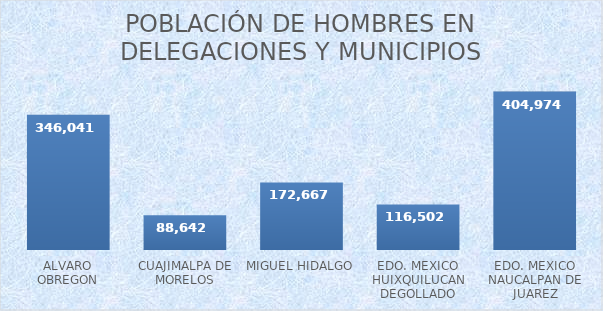
| Category | POBLACIÓN DE HOMBRES |
|---|---|
| ALVARO OBREGON | 346041 |
| CUAJIMALPA DE MORELOS | 88642 |
| MIGUEL HIDALGO | 172667 |
| EDO. MEXICO HUIXQUILUCAN DEGOLLADO | 116502 |
| EDO. MEXICO NAUCALPAN DE JUAREZ | 404974 |